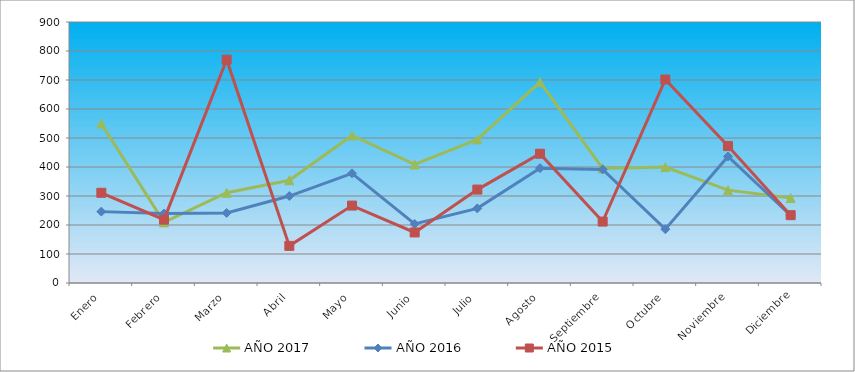
| Category | AÑO 2017 | AÑO 2016 | AÑO 2015 |
|---|---|---|---|
| Enero | 549.677 | 246.123 | 311.121 |
| Febrero | 208.968 | 239.411 | 218.447 |
| Marzo | 311.181 | 241.648 | 770.079 |
| Abril | 354.337 | 299.823 | 127.979 |
| Mayo | 508.792 | 378.135 | 266.99 |
| Junio | 408.851 | 203.611 | 174.316 |
| Julio | 495.164 | 257.311 | 322.154 |
| Agosto | 692.775 | 396.035 | 445.719 |
| Septiembre | 395.222 | 391.56 | 211.827 |
| Octubre | 399.765 | 185.711 | 701.677 |
| Noviembre | 320.266 | 436.309 | 472.198 |
| Diciembre | 293.01 | 232.698 | 233.892 |